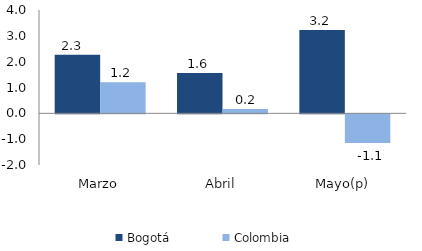
| Category | Bogotá | Colombia |
|---|---|---|
| Marzo | 2.266 | 1.202 |
| Abril | 1.561 | 0.169 |
| Mayo(p) | 3.224 | -1.108 |